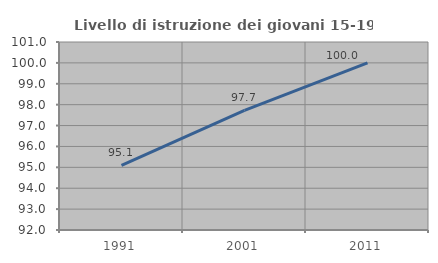
| Category | Livello di istruzione dei giovani 15-19 anni |
|---|---|
| 1991.0 | 95.098 |
| 2001.0 | 97.727 |
| 2011.0 | 100 |